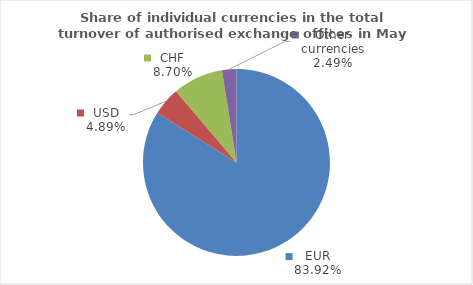
| Category | Series 0 |
|---|---|
| EUR | 83.923 |
| USD | 4.885 |
| CHF | 8.703 |
| Other currencies | 2.489 |